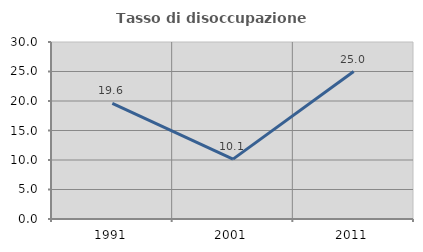
| Category | Tasso di disoccupazione giovanile  |
|---|---|
| 1991.0 | 19.595 |
| 2001.0 | 10.145 |
| 2011.0 | 25 |